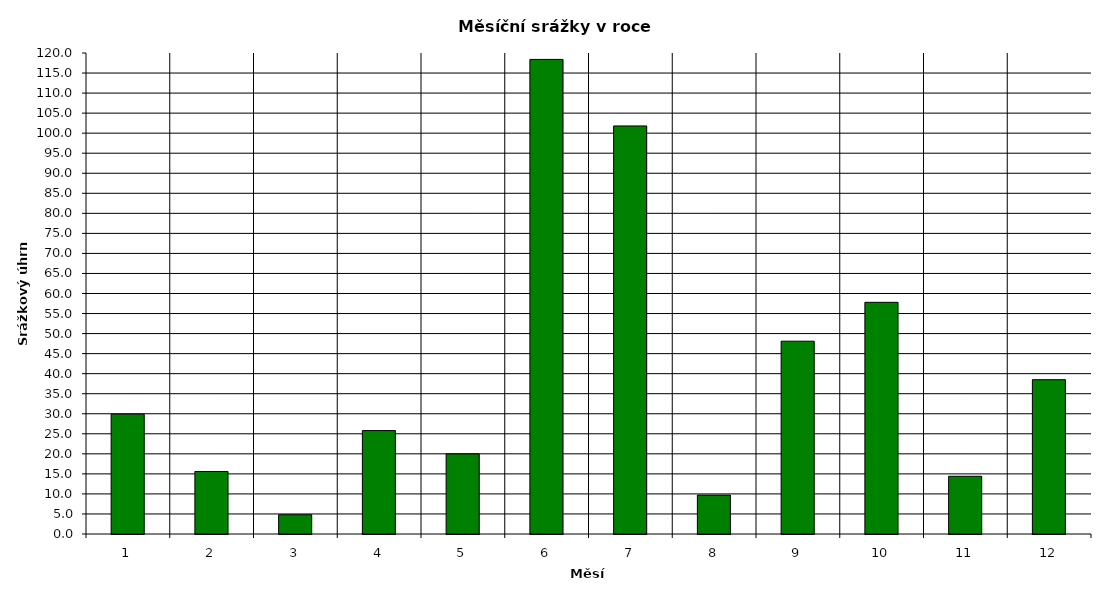
| Category | Series 0 |
|---|---|
| 0 | 29.9 |
| 1 | 15.6 |
| 2 | 4.8 |
| 3 | 25.8 |
| 4 | 20 |
| 5 | 118.4 |
| 6 | 101.8 |
| 7 | 9.7 |
| 8 | 48.1 |
| 9 | 57.8 |
| 10 | 14.4 |
| 11 | 38.5 |